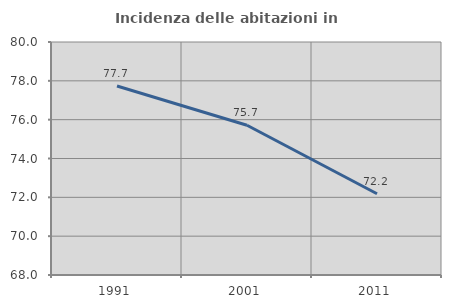
| Category | Incidenza delle abitazioni in proprietà  |
|---|---|
| 1991.0 | 77.731 |
| 2001.0 | 75.714 |
| 2011.0 | 72.183 |